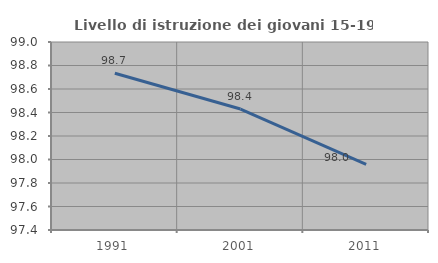
| Category | Livello di istruzione dei giovani 15-19 anni |
|---|---|
| 1991.0 | 98.734 |
| 2001.0 | 98.429 |
| 2011.0 | 97.959 |